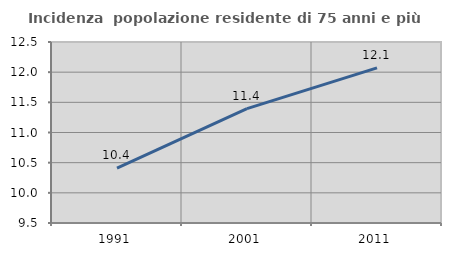
| Category | Incidenza  popolazione residente di 75 anni e più |
|---|---|
| 1991.0 | 10.408 |
| 2001.0 | 11.395 |
| 2011.0 | 12.07 |